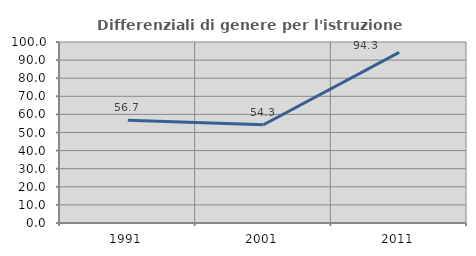
| Category | Differenziali di genere per l'istruzione superiore |
|---|---|
| 1991.0 | 56.729 |
| 2001.0 | 54.264 |
| 2011.0 | 94.289 |